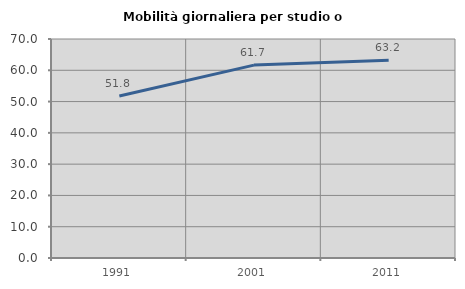
| Category | Mobilità giornaliera per studio o lavoro |
|---|---|
| 1991.0 | 51.775 |
| 2001.0 | 61.651 |
| 2011.0 | 63.245 |